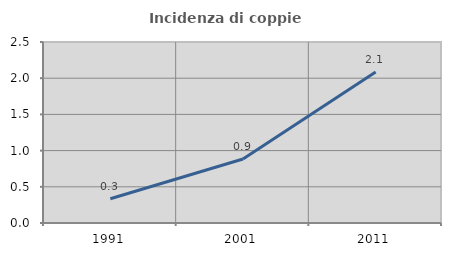
| Category | Incidenza di coppie miste |
|---|---|
| 1991.0 | 0.336 |
| 2001.0 | 0.883 |
| 2011.0 | 2.086 |